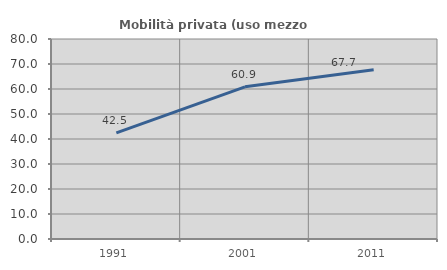
| Category | Mobilità privata (uso mezzo privato) |
|---|---|
| 1991.0 | 42.477 |
| 2001.0 | 60.881 |
| 2011.0 | 67.716 |